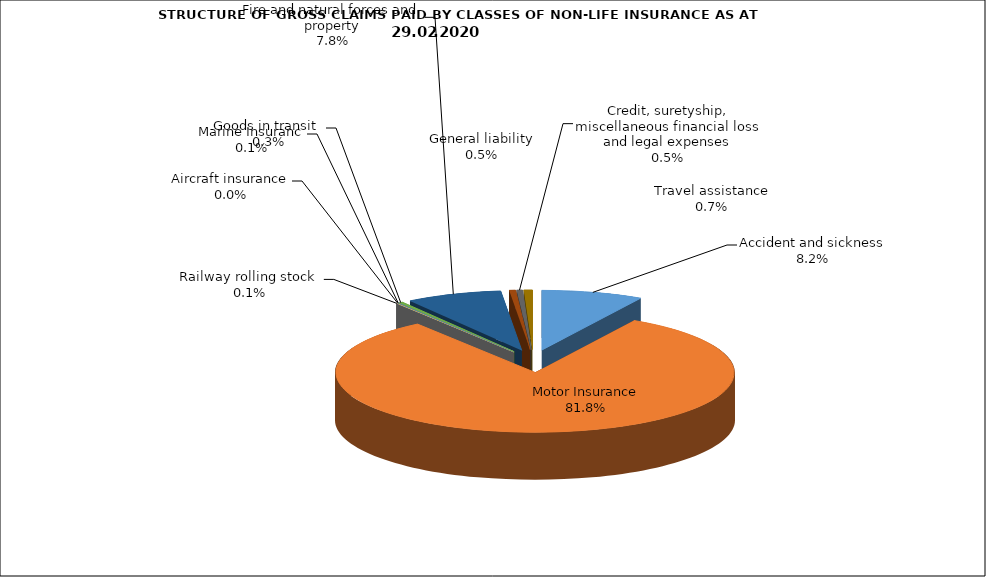
| Category | Accident and sickness | Series 1 |
|---|---|---|
| Accident and sickness | 0.082 |  |
| Motor Insurance | 0.818 |  |
| Railway rolling stock  | 0.001 |  |
| Aircraft insurance | 0 |  |
| Marine Insuranc | 0.001 |  |
| Goods in transit  | 0.003 |  |
| Fire and natural forces and property | 0.078 |  |
| General liability | 0.005 |  |
| Credit, suretyship, miscellaneous financial loss and legal expenses | 0.005 |  |
| Travel assistance | 0.007 |  |